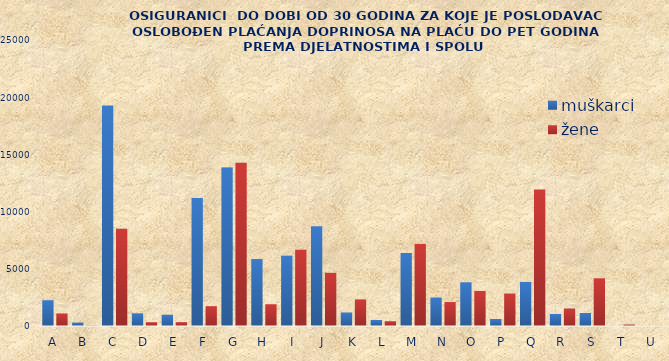
| Category | muškarci | žene |
|---|---|---|
| A | 2254 | 1091 |
| B | 294 | 31 |
| C | 19283 | 8509 |
| D | 1111 | 333 |
| E | 983 | 338 |
| F | 11189 | 1733 |
| G | 13845 | 14268 |
| H | 5854 | 1903 |
| I | 6143 | 6667 |
| J | 8716 | 4646 |
| K | 1183 | 2328 |
| L | 524 | 417 |
| M | 6381 | 7177 |
| N | 2480 | 2094 |
| O | 3820 | 3065 |
| P | 612 | 2832 |
| Q | 3851 | 11932 |
| R | 1052 | 1527 |
| S | 1139 | 4171 |
| T | 19 | 124 |
| U | 10 | 15 |